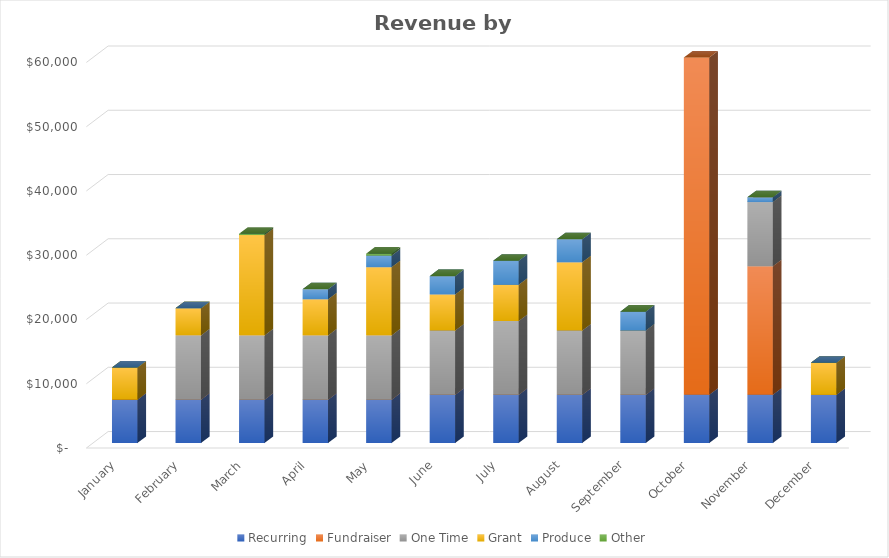
| Category | Recurring | Fundraiser | One Time | Grant | Produce | Other |
|---|---|---|---|---|---|---|
| January | 6750 | 0 | 0 | 5000 | 0 | 0 |
| February | 6750 | 0 | 10000 | 4215.46 | 0 | 0 |
| March | 6750 | 0 | 10000 | 15620.613 | 0 | 200 |
| April | 6750 | 0 | 10000 | 5620.613 | 1551.345 | 0 |
| May | 6750 | 0 | 10000 | 10620.613 | 1801.562 | 300 |
| June | 7500 | 0 | 10000 | 5620.613 | 2852.472 | 0 |
| July | 7500 | 0 | 11500 | 5620.613 | 3753.253 | 0 |
| August | 7500 | 0 | 10000 | 10620.613 | 3603.123 | 0 |
| September | 7500 | 0 | 10000 | 0 | 2952.559 | 0 |
| October | 7500 | 180000 | 10000 | 21961 | 2752.386 | 1500 |
| November | 7500 | 20000 | 10000 | 0 | 750.651 | 0 |
| December | 7500 | 0 | 0 | 5000 | 0 | 0 |